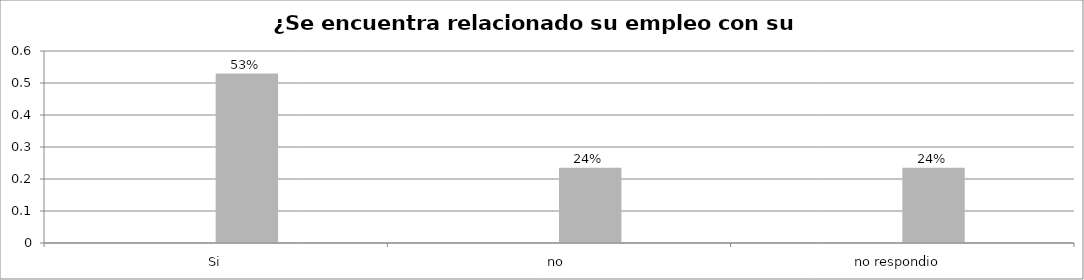
| Category | Series 0 | Series 1 | Series 2 | Series 3 |
|---|---|---|---|---|
| Si |  |  | 0.529 |  |
| no  |  |  | 0.235 |  |
| no respondio  |  |  | 0.235 |  |